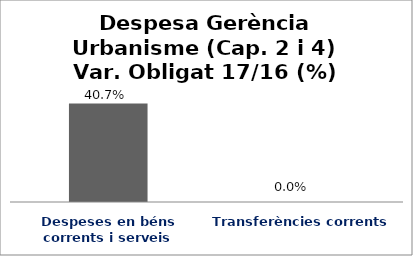
| Category | Series 0 |
|---|---|
| Despeses en béns corrents i serveis | 0.407 |
| Transferències corrents | 0 |